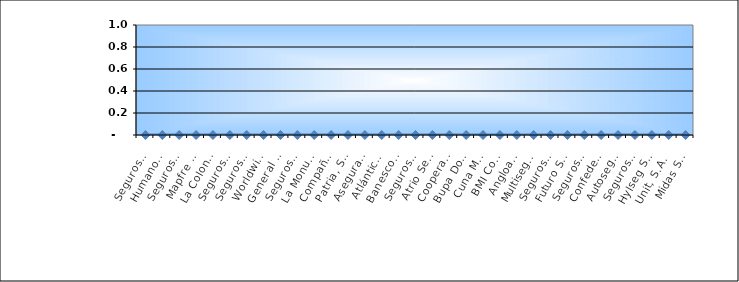
| Category | Series 0 |
|---|---|
| Seguros Universal, S. A. | 0 |
| Humano Seguros, S. A. | 0 |
| Seguros Reservas, S. A. | 0 |
| Mapfre BHD Compañía de Seguros | 0 |
| La Colonial, S. A., Compañia De Seguros | 0 |
| Seguros Sura, S.A. | 0 |
| Seguros Crecer, S. A. | 0 |
| Worldwide Seguros, S. A. | 0 |
| General de Seguros, S. A. | 0 |
| Seguros Pepín, S. A. | 0 |
| La Monumental de Seguros, S. A. | 0 |
| Compañía Dominicana de Seguros, C. por A. | 0 |
| Patria, S. A., Compañía de Seguros | 0 |
| Aseguradora Agropecuaria Dominicana, S. A. | 0 |
| Atlántica Seguros, S. A. | 0 |
| Banesco Seguros | 0 |
| Seguros La Internacional, S. A. | 0 |
| Atrio Seguros S. A. | 0 |
| Cooperativa Nacional De Seguros, Inc  | 0 |
| Bupa Dominicana, S. A. | 0 |
| Cuna Mutual Insurance Society Dominicana | 0 |
| BMI Compañía de Seguros, S. A. | 0 |
| Angloamericana de Seguros, S. A. | 0 |
| Multiseguros Su, S.A. | 0 |
| Seguros APS, S.R.L. | 0 |
| Futuro Seguros | 0 |
| Seguros Ademi, S.A. | 0 |
| Confederación del Canadá Dominicana, S. A. | 0 |
| Autoseguro, S. A. | 0 |
| Seguros Yunen, S.A. | 0 |
| Hylseg Seguros S.A | 0 |
| Unit, S.A. | 0 |
| Midas Seguros, S.A. | 0 |